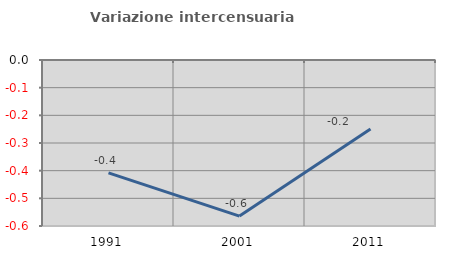
| Category | Variazione intercensuaria annua |
|---|---|
| 1991.0 | -0.408 |
| 2001.0 | -0.564 |
| 2011.0 | -0.249 |